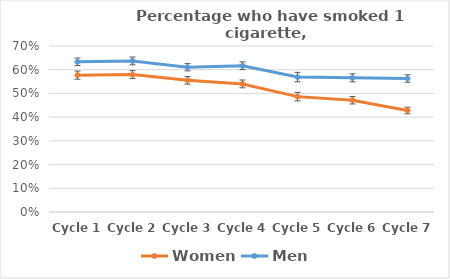
| Category | Women | Men |
|---|---|---|
| Cycle 1 | 0.577 | 0.633 |
| Cycle 2 | 0.579 | 0.637 |
| Cycle 3 | 0.555 | 0.61 |
| Cycle 4 | 0.54 | 0.617 |
| Cycle 5 | 0.486 | 0.569 |
| Cycle 6 | 0.471 | 0.566 |
| Cycle 7 | 0.428 | 0.563 |